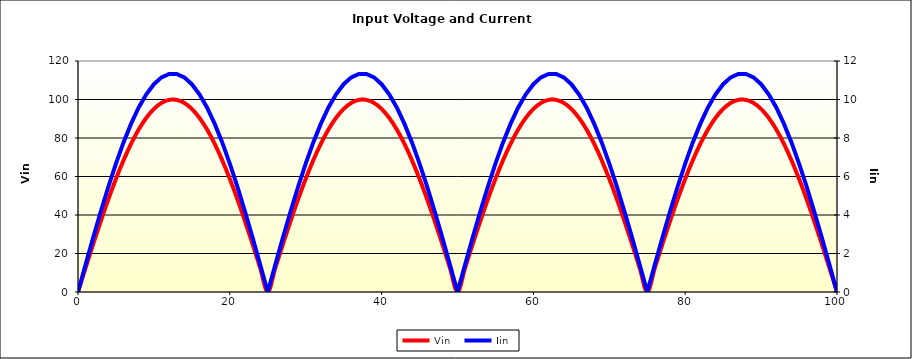
| Category | Vin |
|---|---|
| 0.0 | 0 |
| 0.1 | 1.257 |
| 0.2 | 2.513 |
| 0.3 | 3.769 |
| 0.4 | 5.024 |
| 0.5 | 6.279 |
| 0.6 | 7.533 |
| 0.7 | 8.785 |
| 0.8 | 10.036 |
| 0.9 | 11.286 |
| 1.0 | 12.533 |
| 2.0 | 24.869 |
| 3.0 | 36.812 |
| 4.0 | 48.175 |
| 5.0 | 58.779 |
| 6.0 | 68.455 |
| 7.0 | 77.051 |
| 8.0 | 84.433 |
| 9.0 | 90.483 |
| 10.0 | 95.106 |
| 11.0 | 98.229 |
| 12.0 | 99.803 |
| 13.0 | 99.803 |
| 14.0 | 98.229 |
| 15.0 | 95.106 |
| 16.0 | 90.483 |
| 17.0 | 84.433 |
| 18.0 | 77.051 |
| 19.0 | 68.455 |
| 20.0 | 58.779 |
| 21.0 | 48.175 |
| 22.0 | 36.812 |
| 23.0 | 24.869 |
| 24.0 | 12.533 |
| 25.0 | 0 |
| 26.0 | 12.533 |
| 27.0 | 24.869 |
| 28.0 | 36.812 |
| 29.0 | 48.175 |
| 30.0 | 58.779 |
| 31.0 | 68.455 |
| 32.0 | 77.051 |
| 33.0 | 84.433 |
| 34.0 | 90.483 |
| 35.0 | 95.106 |
| 36.0 | 98.229 |
| 37.0 | 99.803 |
| 38.0 | 99.803 |
| 39.0 | 98.229 |
| 40.0 | 95.106 |
| 41.0 | 90.483 |
| 42.0 | 84.433 |
| 43.0 | 77.051 |
| 44.0 | 68.455 |
| 45.0 | 58.779 |
| 46.0 | 48.175 |
| 47.0 | 36.812 |
| 48.0 | 24.869 |
| 49.0 | 12.533 |
| 50.0 | 0 |
| 51.0 | 12.533 |
| 52.0 | 24.869 |
| 53.0 | 36.812 |
| 54.0 | 48.175 |
| 55.0 | 58.779 |
| 56.0 | 68.455 |
| 57.0 | 77.051 |
| 58.0 | 84.433 |
| 59.0 | 90.483 |
| 60.0 | 95.106 |
| 61.0 | 98.229 |
| 62.0 | 99.803 |
| 63.0 | 99.803 |
| 64.0 | 98.229 |
| 65.0 | 95.106 |
| 66.0 | 90.483 |
| 67.0 | 84.433 |
| 68.0 | 77.051 |
| 69.0 | 68.455 |
| 70.0 | 58.779 |
| 71.0 | 48.175 |
| 72.0 | 36.812 |
| 73.0 | 24.869 |
| 74.0 | 12.533 |
| 75.0 | 0 |
| 76.0 | 12.533 |
| 77.0 | 24.869 |
| 78.0 | 36.812 |
| 79.0 | 48.175 |
| 80.0 | 58.779 |
| 81.0 | 68.455 |
| 82.0 | 77.051 |
| 83.0 | 84.433 |
| 84.0 | 90.483 |
| 85.0 | 95.106 |
| 86.0 | 98.229 |
| 87.0 | 99.803 |
| 88.0 | 99.803 |
| 89.0 | 98.229 |
| 90.0 | 95.106 |
| 91.0 | 90.483 |
| 92.0 | 84.433 |
| 93.0 | 77.051 |
| 94.0 | 68.455 |
| 95.0 | 58.779 |
| 96.0 | 48.175 |
| 97.0 | 36.812 |
| 98.0 | 24.869 |
| 99.0 | 12.533 |
| 100.0 | 0 |